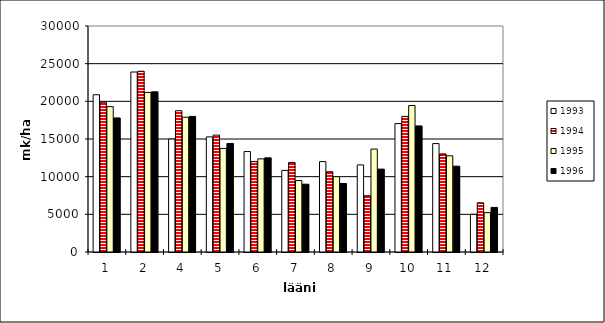
| Category | 1993 | 1994 | 1995 | 1996 |
|---|---|---|---|---|
| 1.0 | 20872 | 19888 | 19298 | 17796 |
| 2.0 | 23893 | 23993 | 21184 | 21258 |
| 4.0 | 15000 | 18750 | 17886 | 18000 |
| 5.0 | 15281 | 15517 | 13750 | 14407 |
| 6.0 | 13333 | 12000 | 12364 | 12500 |
| 7.0 | 10837 | 11887 | 9482 | 9000 |
| 8.0 | 12000 | 10652 | 10000 | 9090 |
| 9.0 | 11560 | 7466 | 13663 | 11000 |
| 10.0 | 17050 | 18000 | 19441 | 16736 |
| 11.0 | 14392 | 13018 | 12771 | 11392 |
| 12.0 | 5000 | 6529 | 5223 | 5916 |